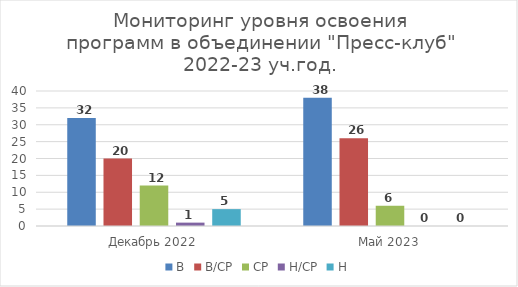
| Category | В | В/СР | СР | Н/СР | Н |
|---|---|---|---|---|---|
| Декабрь 2022 | 32 | 20 | 12 | 1 | 5 |
| Май 2023 | 38 | 26 | 6 | 0 | 0 |